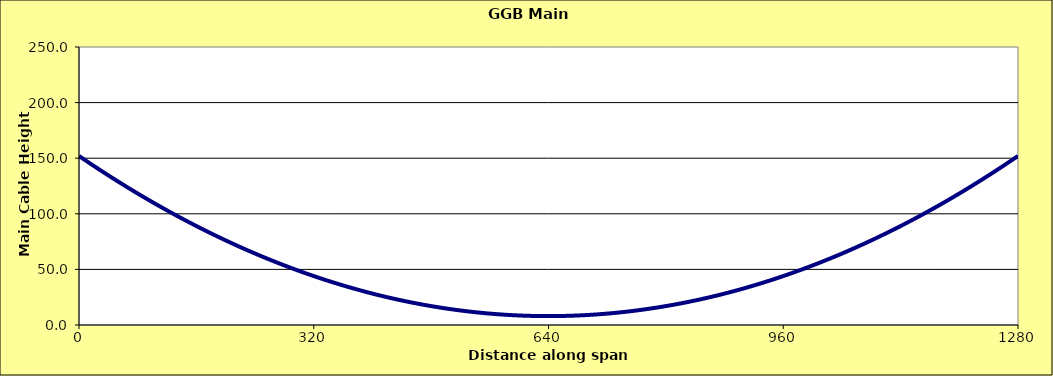
| Category | cable height
Y (m) |
|---|---|
| 0.0 | 152 |
| 5.0 | 149.759 |
| 10.0 | 147.535 |
| 15.0 | 145.329 |
| 20.0 | 143.141 |
| 25.0 | 140.97 |
| 30.0 | 138.816 |
| 35.0 | 136.681 |
| 40.0 | 134.562 |
| 45.0 | 132.462 |
| 50.0 | 130.379 |
| 55.0 | 128.313 |
| 60.0 | 126.266 |
| 65.0 | 124.235 |
| 70.0 | 122.223 |
| 75.0 | 120.228 |
| 80.0 | 118.25 |
| 85.0 | 116.29 |
| 90.0 | 114.348 |
| 95.0 | 112.423 |
| 100.0 | 110.516 |
| 105.0 | 108.626 |
| 110.0 | 106.754 |
| 115.0 | 104.899 |
| 120.0 | 103.062 |
| 125.0 | 101.243 |
| 130.0 | 99.441 |
| 135.0 | 97.657 |
| 140.0 | 95.891 |
| 145.0 | 94.142 |
| 150.0 | 92.41 |
| 155.0 | 90.696 |
| 160.0 | 89 |
| 160.001 | 89 |
| 165.0 | 87.321 |
| 170.0 | 85.66 |
| 175.0 | 84.017 |
| 180.0 | 82.391 |
| 185.0 | 80.782 |
| 190.0 | 79.191 |
| 195.0 | 77.618 |
| 200.0 | 76.063 |
| 205.0 | 74.524 |
| 210.0 | 73.004 |
| 215.0 | 71.501 |
| 220.0 | 70.016 |
| 225.0 | 68.548 |
| 230.0 | 67.098 |
| 235.0 | 65.665 |
| 240.0 | 64.25 |
| 245.0 | 62.853 |
| 250.0 | 61.473 |
| 255.0 | 60.11 |
| 260.0 | 58.766 |
| 265.0 | 57.438 |
| 270.0 | 56.129 |
| 275.0 | 54.837 |
| 280.0 | 53.563 |
| 285.0 | 52.306 |
| 290.0 | 51.066 |
| 295.0 | 49.845 |
| 300.0 | 48.641 |
| 305.0 | 47.454 |
| 310.0 | 46.285 |
| 315.0 | 45.134 |
| 320.0 | 44 |
| 320.001 | 44 |
| 325.0 | 42.884 |
| 330.0 | 41.785 |
| 335.0 | 40.704 |
| 340.0 | 39.641 |
| 345.0 | 38.595 |
| 350.0 | 37.566 |
| 355.0 | 36.556 |
| 360.0 | 35.562 |
| 365.0 | 34.587 |
| 370.0 | 33.629 |
| 375.0 | 32.688 |
| 380.0 | 31.766 |
| 385.0 | 30.86 |
| 390.0 | 29.973 |
| 395.0 | 29.103 |
| 400.0 | 28.25 |
| 405.0 | 27.415 |
| 410.0 | 26.598 |
| 415.0 | 25.798 |
| 420.0 | 25.016 |
| 425.0 | 24.251 |
| 430.0 | 23.504 |
| 435.0 | 22.774 |
| 440.0 | 22.062 |
| 445.0 | 21.368 |
| 450.0 | 20.691 |
| 455.0 | 20.032 |
| 460.0 | 19.391 |
| 465.0 | 18.767 |
| 470.0 | 18.16 |
| 475.0 | 17.571 |
| 480.0 | 17 |
| 480.001 | 17 |
| 485.0 | 16.446 |
| 490.0 | 15.91 |
| 495.0 | 15.392 |
| 500.0 | 14.891 |
| 505.0 | 14.407 |
| 510.0 | 13.941 |
| 515.0 | 13.493 |
| 520.0 | 13.062 |
| 525.0 | 12.649 |
| 530.0 | 12.254 |
| 535.0 | 11.876 |
| 540.0 | 11.516 |
| 545.0 | 11.173 |
| 550.0 | 10.848 |
| 555.0 | 10.54 |
| 560.0 | 10.25 |
| 565.0 | 9.978 |
| 570.0 | 9.723 |
| 575.0 | 9.485 |
| 580.0 | 9.266 |
| 585.0 | 9.063 |
| 590.0 | 8.879 |
| 595.0 | 8.712 |
| 600.0 | 8.562 |
| 605.0 | 8.431 |
| 610.0 | 8.316 |
| 615.0 | 8.22 |
| 620.0 | 8.141 |
| 625.0 | 8.079 |
| 630.0 | 8.035 |
| 635.0 | 8.009 |
| 640.0 | 8 |
| 645.0 | 8.009 |
| 650.0 | 8.035 |
| 655.0 | 8.079 |
| 660.0 | 8.141 |
| 665.0 | 8.22 |
| 670.0 | 8.316 |
| 675.0 | 8.431 |
| 680.0 | 8.562 |
| 685.0 | 8.712 |
| 690.0 | 8.879 |
| 695.0 | 9.063 |
| 700.0 | 9.266 |
| 705.0 | 9.485 |
| 710.0 | 9.723 |
| 715.0 | 9.978 |
| 720.0 | 10.25 |
| 725.0 | 10.54 |
| 730.0 | 10.848 |
| 735.0 | 11.173 |
| 740.0 | 11.516 |
| 745.0 | 11.876 |
| 750.0 | 12.254 |
| 755.0 | 12.649 |
| 760.0 | 13.062 |
| 765.0 | 13.493 |
| 770.0 | 13.941 |
| 775.0 | 14.407 |
| 780.0 | 14.891 |
| 785.0 | 15.392 |
| 790.0 | 15.91 |
| 795.0 | 16.446 |
| 800.0 | 17 |
| 805.0 | 17.571 |
| 810.0 | 18.16 |
| 815.0 | 18.767 |
| 820.0 | 19.391 |
| 825.0 | 20.032 |
| 830.0 | 20.691 |
| 835.0 | 21.368 |
| 840.0 | 22.062 |
| 845.0 | 22.774 |
| 850.0 | 23.504 |
| 855.0 | 24.251 |
| 860.0 | 25.016 |
| 865.0 | 25.798 |
| 870.0 | 26.598 |
| 875.0 | 27.415 |
| 880.0 | 28.25 |
| 885.0 | 29.103 |
| 890.0 | 29.973 |
| 895.0 | 30.86 |
| 900.0 | 31.766 |
| 905.0 | 32.688 |
| 910.0 | 33.629 |
| 915.0 | 34.587 |
| 920.0 | 35.562 |
| 925.0 | 36.556 |
| 930.0 | 37.566 |
| 935.0 | 38.595 |
| 940.0 | 39.641 |
| 945.0 | 40.704 |
| 950.0 | 41.785 |
| 955.0 | 42.884 |
| 960.0 | 44 |
| 965.0 | 45.134 |
| 970.0 | 46.285 |
| 975.0 | 47.454 |
| 980.0 | 48.641 |
| 985.0 | 49.845 |
| 990.0 | 51.066 |
| 995.0 | 52.306 |
| 1000.0 | 53.563 |
| 1005.0 | 54.837 |
| 1010.0 | 56.129 |
| 1015.0 | 57.438 |
| 1020.0 | 58.766 |
| 1025.0 | 60.11 |
| 1030.0 | 61.473 |
| 1035.0 | 62.853 |
| 1040.0 | 64.25 |
| 1045.0 | 65.665 |
| 1050.0 | 67.098 |
| 1055.0 | 68.548 |
| 1060.0 | 70.016 |
| 1065.0 | 71.501 |
| 1070.0 | 73.004 |
| 1075.0 | 74.524 |
| 1080.0 | 76.063 |
| 1085.0 | 77.618 |
| 1090.0 | 79.191 |
| 1095.0 | 80.782 |
| 1100.0 | 82.391 |
| 1105.0 | 84.017 |
| 1110.0 | 85.66 |
| 1115.0 | 87.321 |
| 1120.0 | 89 |
| 1125.0 | 90.696 |
| 1130.0 | 92.41 |
| 1135.0 | 94.142 |
| 1140.0 | 95.891 |
| 1145.0 | 97.657 |
| 1150.0 | 99.441 |
| 1155.0 | 101.243 |
| 1160.0 | 103.062 |
| 1165.0 | 104.899 |
| 1170.0 | 106.754 |
| 1175.0 | 108.626 |
| 1180.0 | 110.516 |
| 1185.0 | 112.423 |
| 1190.0 | 114.348 |
| 1195.0 | 116.29 |
| 1200.0 | 118.25 |
| 1205.0 | 120.228 |
| 1210.0 | 122.223 |
| 1215.0 | 124.235 |
| 1220.0 | 126.266 |
| 1225.0 | 128.313 |
| 1230.0 | 130.379 |
| 1235.0 | 132.462 |
| 1240.0 | 134.562 |
| 1245.0 | 136.681 |
| 1250.0 | 138.816 |
| 1255.0 | 140.97 |
| 1260.0 | 143.141 |
| 1265.0 | 145.329 |
| 1270.0 | 147.535 |
| 1275.0 | 149.759 |
| 1280.0 | 152 |